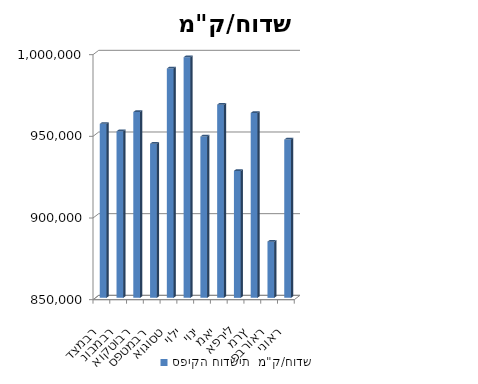
| Category | ספיקה חודשית  |
|---|---|
| ינואר | 946890 |
| פברואר | 884425 |
| מרץ | 963170 |
| אפריל | 927728 |
| מאי | 968284 |
| יוני | 948775 |
| יולי | 997304 |
| אוגוסט | 990414 |
| ספטמבר | 944387 |
| אוקטובר | 963757 |
| נובמבר | 951952 |
| דצמבר | 956521 |